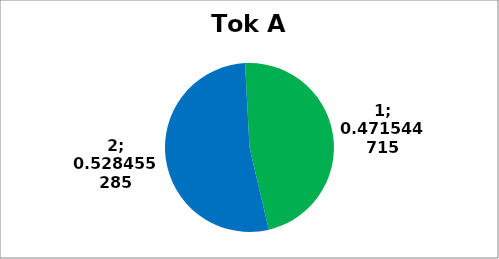
| Category | Series 0 |
|---|---|
| 0 | 116 |
| 1 | 130 |